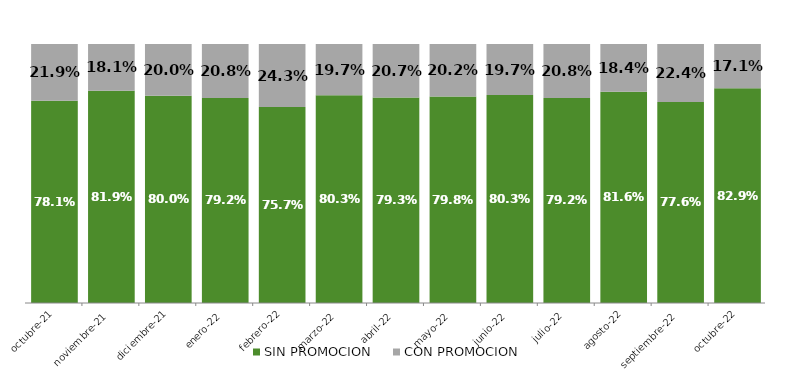
| Category | SIN PROMOCION   | CON PROMOCION   |
|---|---|---|
| 2021-10-01 | 0.781 | 0.219 |
| 2021-11-01 | 0.819 | 0.181 |
| 2021-12-01 | 0.8 | 0.2 |
| 2022-01-01 | 0.792 | 0.208 |
| 2022-02-01 | 0.757 | 0.243 |
| 2022-03-01 | 0.803 | 0.197 |
| 2022-04-01 | 0.793 | 0.207 |
| 2022-05-01 | 0.798 | 0.202 |
| 2022-06-01 | 0.803 | 0.197 |
| 2022-07-01 | 0.792 | 0.208 |
| 2022-08-01 | 0.816 | 0.184 |
| 2022-09-01 | 0.776 | 0.224 |
| 2022-10-01 | 0.829 | 0.171 |